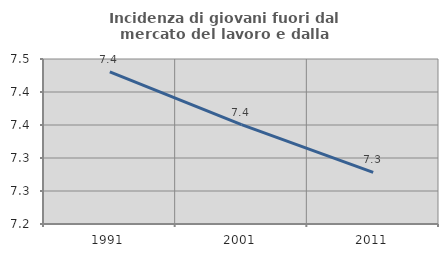
| Category | Incidenza di giovani fuori dal mercato del lavoro e dalla formazione  |
|---|---|
| 1991.0 | 7.43 |
| 2001.0 | 7.351 |
| 2011.0 | 7.278 |